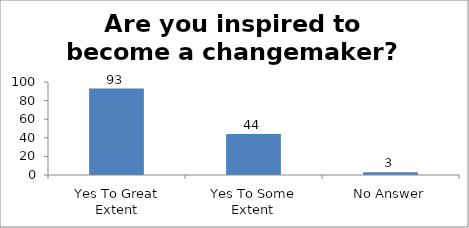
| Category | Are you inspired to become a changemaker?   |
|---|---|
| Yes To Great Extent | 93 |
| Yes To Some Extent | 44 |
| No Answer | 3 |